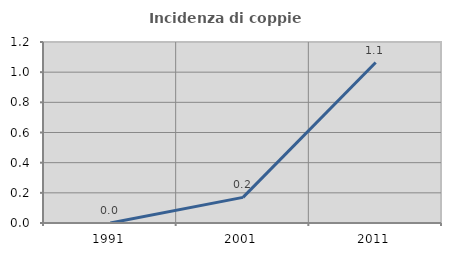
| Category | Incidenza di coppie miste |
|---|---|
| 1991.0 | 0 |
| 2001.0 | 0.17 |
| 2011.0 | 1.064 |